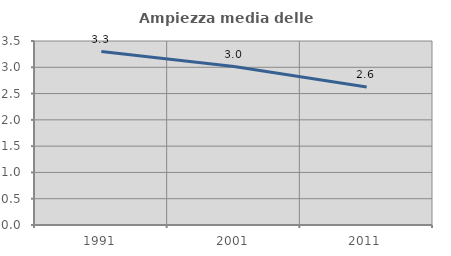
| Category | Ampiezza media delle famiglie |
|---|---|
| 1991.0 | 3.299 |
| 2001.0 | 3.013 |
| 2011.0 | 2.624 |